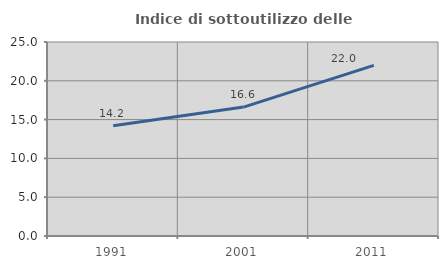
| Category | Indice di sottoutilizzo delle abitazioni  |
|---|---|
| 1991.0 | 14.214 |
| 2001.0 | 16.613 |
| 2011.0 | 21.986 |